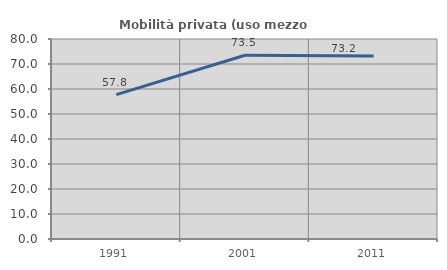
| Category | Mobilità privata (uso mezzo privato) |
|---|---|
| 1991.0 | 57.761 |
| 2001.0 | 73.5 |
| 2011.0 | 73.207 |